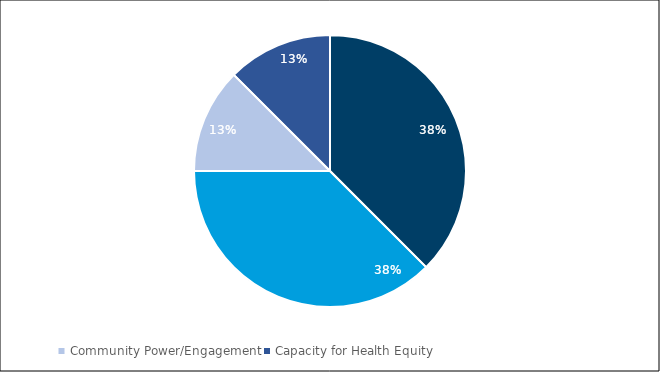
| Category | Votes for "What Focus Area stood out as most important?" |
|---|---|
| Resources | 3 |
| Workforce  | 3 |
| Community Power/Engagement | 1 |
| Capacity for Health Equity | 1 |